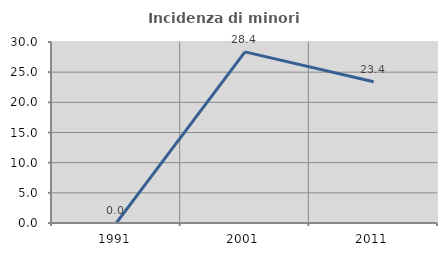
| Category | Incidenza di minori stranieri |
|---|---|
| 1991.0 | 0 |
| 2001.0 | 28.358 |
| 2011.0 | 23.415 |